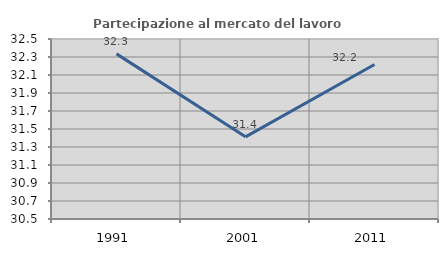
| Category | Partecipazione al mercato del lavoro  femminile |
|---|---|
| 1991.0 | 32.335 |
| 2001.0 | 31.413 |
| 2011.0 | 32.217 |